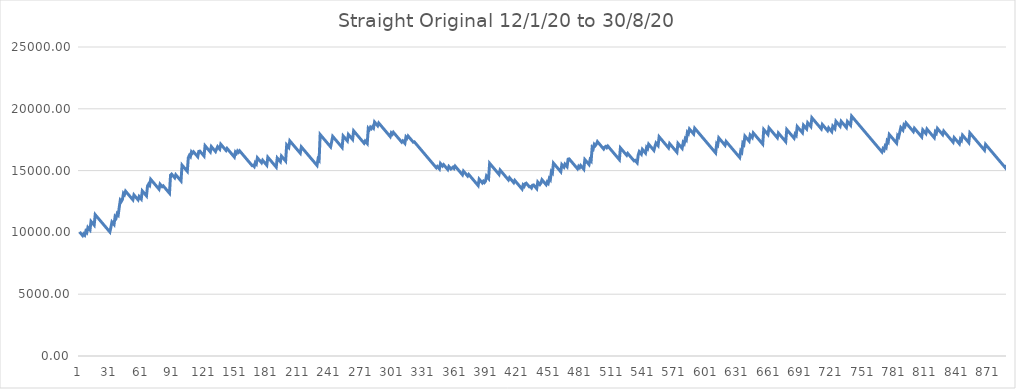
| Category | Series 0 |
|---|---|
| 0 | 10038.22 |
| 1 | 9938.22 |
| 2 | 9838.22 |
| 3 | 9738.22 |
| 4 | 9885.22 |
| 5 | 9785.22 |
| 6 | 10096.86 |
| 7 | 9996.86 |
| 8 | 10395.76 |
| 9 | 10295.76 |
| 10 | 10195.76 |
| 11 | 10887.64 |
| 12 | 10787.64 |
| 13 | 10687.64 |
| 14 | 10587.64 |
| 15 | 11432.44 |
| 16 | 11332.44 |
| 17 | 11232.44 |
| 18 | 11132.44 |
| 19 | 11032.44 |
| 20 | 10932.44 |
| 21 | 10832.44 |
| 22 | 10732.44 |
| 23 | 10632.44 |
| 24 | 10532.44 |
| 25 | 10432.44 |
| 26 | 10332.44 |
| 27 | 10232.44 |
| 28 | 10132.44 |
| 29 | 10032.44 |
| 30 | 10420.52 |
| 31 | 10841.92 |
| 32 | 10741.92 |
| 33 | 10641.92 |
| 34 | 11275 |
| 35 | 11175 |
| 36 | 11510.16 |
| 37 | 11410.16 |
| 38 | 12050.14 |
| 39 | 12613.68 |
| 40 | 12513.68 |
| 41 | 12664.6 |
| 42 | 13160.48 |
| 43 | 13060.48 |
| 44 | 13335.9 |
| 45 | 13235.9 |
| 46 | 13135.9 |
| 47 | 13035.9 |
| 48 | 12935.9 |
| 49 | 12835.9 |
| 50 | 12735.9 |
| 51 | 12635.9 |
| 52 | 13032.8 |
| 53 | 12932.8 |
| 54 | 12832.8 |
| 55 | 12732.8 |
| 56 | 12632.8 |
| 57 | 12898.46 |
| 58 | 12798.46 |
| 59 | 12698.46 |
| 60 | 13355.1 |
| 61 | 13255.1 |
| 62 | 13155.1 |
| 63 | 13055.1 |
| 64 | 12955.1 |
| 65 | 13750.98 |
| 66 | 13905.86 |
| 67 | 13805.86 |
| 68 | 14295.86 |
| 69 | 14195.86 |
| 70 | 14095.86 |
| 71 | 13995.86 |
| 72 | 13895.86 |
| 73 | 13795.86 |
| 74 | 13695.86 |
| 75 | 13595.86 |
| 76 | 13495.86 |
| 77 | 13899.66 |
| 78 | 13799.66 |
| 79 | 13699.66 |
| 80 | 13765.32 |
| 81 | 13665.32 |
| 82 | 13565.32 |
| 83 | 13465.32 |
| 84 | 13365.32 |
| 85 | 13265.32 |
| 86 | 13165.32 |
| 87 | 14636.38 |
| 88 | 14717.72 |
| 89 | 14617.72 |
| 90 | 14517.72 |
| 91 | 14417.72 |
| 92 | 14661.82 |
| 93 | 14561.82 |
| 94 | 14461.82 |
| 95 | 14361.82 |
| 96 | 14261.82 |
| 97 | 14161.82 |
| 98 | 15441.82 |
| 99 | 15341.82 |
| 100 | 15241.82 |
| 101 | 15141.82 |
| 102 | 15041.82 |
| 103 | 14941.82 |
| 104 | 16045.3 |
| 105 | 16229.58 |
| 106 | 16129.58 |
| 107 | 16513.78 |
| 108 | 16413.78 |
| 109 | 16519.66 |
| 110 | 16419.66 |
| 111 | 16319.66 |
| 112 | 16219.66 |
| 113 | 16119.66 |
| 114 | 16552.86 |
| 115 | 16578.34 |
| 116 | 16478.34 |
| 117 | 16378.34 |
| 118 | 16278.34 |
| 119 | 16178.34 |
| 120 | 17008.48 |
| 121 | 16908.48 |
| 122 | 16808.48 |
| 123 | 16708.48 |
| 124 | 16608.48 |
| 125 | 16508.48 |
| 126 | 16941.68 |
| 127 | 16841.68 |
| 128 | 16741.68 |
| 129 | 16641.68 |
| 130 | 16541.68 |
| 131 | 16747.48 |
| 132 | 16936.66 |
| 133 | 16836.66 |
| 134 | 16736.66 |
| 135 | 17132.66 |
| 136 | 17032.66 |
| 137 | 16932.66 |
| 138 | 16832.66 |
| 139 | 16732.66 |
| 140 | 16632.66 |
| 141 | 16793.42 |
| 142 | 16693.42 |
| 143 | 16593.42 |
| 144 | 16493.42 |
| 145 | 16393.42 |
| 146 | 16293.42 |
| 147 | 16193.42 |
| 148 | 16093.42 |
| 149 | 16497.26 |
| 150 | 16397.26 |
| 151 | 16583.46 |
| 152 | 16483.46 |
| 153 | 16601.06 |
| 154 | 16501.06 |
| 155 | 16401.06 |
| 156 | 16301.06 |
| 157 | 16201.06 |
| 158 | 16101.06 |
| 159 | 16001.06 |
| 160 | 15901.06 |
| 161 | 15801.06 |
| 162 | 15701.06 |
| 163 | 15601.06 |
| 164 | 15501.06 |
| 165 | 15401.06 |
| 166 | 15430.46 |
| 167 | 15330.46 |
| 168 | 15640.22 |
| 169 | 15540.22 |
| 170 | 16035.2 |
| 171 | 15935.2 |
| 172 | 15835.2 |
| 173 | 15735.2 |
| 174 | 15635.2 |
| 175 | 15835.2 |
| 176 | 15735.2 |
| 177 | 15635.2 |
| 178 | 15535.2 |
| 179 | 15435.2 |
| 180 | 16082.04 |
| 181 | 15982.04 |
| 182 | 15882.04 |
| 183 | 15782.04 |
| 184 | 15682.04 |
| 185 | 15582.04 |
| 186 | 15482.04 |
| 187 | 15382.04 |
| 188 | 15282.04 |
| 189 | 16018.06 |
| 190 | 15918.06 |
| 191 | 15818.06 |
| 192 | 15718.06 |
| 193 | 16174.86 |
| 194 | 16074.86 |
| 195 | 15974.86 |
| 196 | 15874.86 |
| 197 | 15774.86 |
| 198 | 17074.38 |
| 199 | 16974.38 |
| 200 | 16874.38 |
| 201 | 17405.58 |
| 202 | 17305.58 |
| 203 | 17205.58 |
| 204 | 17105.58 |
| 205 | 17005.58 |
| 206 | 16905.58 |
| 207 | 16805.58 |
| 208 | 16705.58 |
| 209 | 16605.58 |
| 210 | 16505.58 |
| 211 | 16405.58 |
| 212 | 16917.18 |
| 213 | 16817.18 |
| 214 | 16717.18 |
| 215 | 16617.18 |
| 216 | 16517.18 |
| 217 | 16417.18 |
| 218 | 16317.18 |
| 219 | 16217.18 |
| 220 | 16117.18 |
| 221 | 16017.18 |
| 222 | 15917.18 |
| 223 | 15817.18 |
| 224 | 15717.18 |
| 225 | 15617.18 |
| 226 | 15517.18 |
| 227 | 15417.18 |
| 228 | 15930.78 |
| 229 | 15830.78 |
| 230 | 17918.22 |
| 231 | 17818.22 |
| 232 | 17718.22 |
| 233 | 17618.22 |
| 234 | 17518.22 |
| 235 | 17418.22 |
| 236 | 17318.22 |
| 237 | 17218.22 |
| 238 | 17118.22 |
| 239 | 17018.22 |
| 240 | 16918.22 |
| 241 | 17326.96 |
| 242 | 17767.96 |
| 243 | 17667.96 |
| 244 | 17567.96 |
| 245 | 17467.96 |
| 246 | 17367.96 |
| 247 | 17267.96 |
| 248 | 17167.96 |
| 249 | 17067.96 |
| 250 | 16967.96 |
| 251 | 16867.96 |
| 252 | 17800.96 |
| 253 | 17700.96 |
| 254 | 17600.96 |
| 255 | 17500.96 |
| 256 | 17400.96 |
| 257 | 17919.42 |
| 258 | 17819.42 |
| 259 | 17719.42 |
| 260 | 17619.42 |
| 261 | 17519.42 |
| 262 | 18216.24 |
| 263 | 18116.24 |
| 264 | 18016.24 |
| 265 | 17916.24 |
| 266 | 17816.24 |
| 267 | 17716.24 |
| 268 | 17616.24 |
| 269 | 17516.24 |
| 270 | 17416.24 |
| 271 | 17316.24 |
| 272 | 17216.24 |
| 273 | 17391.7 |
| 274 | 17291.7 |
| 275 | 17191.7 |
| 276 | 18418.7 |
| 277 | 18318.7 |
| 278 | 18502 |
| 279 | 18402 |
| 280 | 18543.16 |
| 281 | 18443.16 |
| 282 | 18930.26 |
| 283 | 18830.26 |
| 284 | 18730.26 |
| 285 | 18630.26 |
| 286 | 18848.88 |
| 287 | 18748.88 |
| 288 | 18648.88 |
| 289 | 18548.88 |
| 290 | 18448.88 |
| 291 | 18348.88 |
| 292 | 18248.88 |
| 293 | 18148.88 |
| 294 | 18048.88 |
| 295 | 17948.88 |
| 296 | 17848.88 |
| 297 | 17748.88 |
| 298 | 18042.96 |
| 299 | 17942.96 |
| 300 | 18097.84 |
| 301 | 17997.84 |
| 302 | 17897.84 |
| 303 | 17797.84 |
| 304 | 17697.84 |
| 305 | 17597.84 |
| 306 | 17497.84 |
| 307 | 17397.84 |
| 308 | 17297.84 |
| 309 | 17405.64 |
| 310 | 17305.64 |
| 311 | 17205.64 |
| 312 | 17719.24 |
| 313 | 17619.24 |
| 314 | 17799.6 |
| 315 | 17699.6 |
| 316 | 17599.6 |
| 317 | 17499.6 |
| 318 | 17399.6 |
| 319 | 17299.6 |
| 320 | 17329 |
| 321 | 17229 |
| 322 | 17129 |
| 323 | 17029 |
| 324 | 16929 |
| 325 | 16829 |
| 326 | 16729 |
| 327 | 16629 |
| 328 | 16529 |
| 329 | 16429 |
| 330 | 16329 |
| 331 | 16229 |
| 332 | 16129 |
| 333 | 16029 |
| 334 | 15929 |
| 335 | 15829 |
| 336 | 15729 |
| 337 | 15629 |
| 338 | 15529 |
| 339 | 15429 |
| 340 | 15329 |
| 341 | 15229 |
| 342 | 15334.88 |
| 343 | 15234.88 |
| 344 | 15134.88 |
| 345 | 15570.08 |
| 346 | 15470.08 |
| 347 | 15370.08 |
| 348 | 15482.78 |
| 349 | 15382.78 |
| 350 | 15282.78 |
| 351 | 15182.78 |
| 352 | 15082.78 |
| 353 | 15331.78 |
| 354 | 15231.78 |
| 355 | 15131.78 |
| 356 | 15202.34 |
| 357 | 15279.76 |
| 358 | 15179.76 |
| 359 | 15361.1 |
| 360 | 15261.1 |
| 361 | 15161.1 |
| 362 | 15061.1 |
| 363 | 14961.1 |
| 364 | 14861.1 |
| 365 | 14761.1 |
| 366 | 14661.1 |
| 367 | 14955.14 |
| 368 | 14855.14 |
| 369 | 14755.14 |
| 370 | 14655.14 |
| 371 | 14555.14 |
| 372 | 14690.42 |
| 373 | 14590.42 |
| 374 | 14490.42 |
| 375 | 14390.42 |
| 376 | 14290.42 |
| 377 | 14190.42 |
| 378 | 14090.42 |
| 379 | 13990.42 |
| 380 | 13890.42 |
| 381 | 13790.42 |
| 382 | 14304.02 |
| 383 | 14204.02 |
| 384 | 14104.02 |
| 385 | 14004.02 |
| 386 | 14131.46 |
| 387 | 14031.46 |
| 388 | 14138.32 |
| 389 | 14559.72 |
| 390 | 14459.72 |
| 391 | 14359.72 |
| 392 | 15588.72 |
| 393 | 15488.72 |
| 394 | 15388.72 |
| 395 | 15288.72 |
| 396 | 15188.72 |
| 397 | 15088.72 |
| 398 | 14988.72 |
| 399 | 14888.72 |
| 400 | 14788.72 |
| 401 | 14688.72 |
| 402 | 15043.52 |
| 403 | 14943.52 |
| 404 | 14843.52 |
| 405 | 14743.52 |
| 406 | 14643.52 |
| 407 | 14543.52 |
| 408 | 14443.52 |
| 409 | 14343.52 |
| 410 | 14243.52 |
| 411 | 14423.92 |
| 412 | 14323.92 |
| 413 | 14223.92 |
| 414 | 14123.92 |
| 415 | 14023.92 |
| 416 | 14207.22 |
| 417 | 14107.22 |
| 418 | 14007.22 |
| 419 | 13907.22 |
| 420 | 13807.22 |
| 421 | 13707.22 |
| 422 | 13607.22 |
| 423 | 13507.22 |
| 424 | 13832.58 |
| 425 | 13732.58 |
| 426 | 13944.26 |
| 427 | 13982.48 |
| 428 | 13882.48 |
| 429 | 13782.48 |
| 430 | 13682.48 |
| 431 | 13703.06 |
| 432 | 13603.06 |
| 433 | 13816.74 |
| 434 | 13837.32 |
| 435 | 13737.32 |
| 436 | 13637.32 |
| 437 | 13537.32 |
| 438 | 14070.52 |
| 439 | 13970.52 |
| 440 | 13870.52 |
| 441 | 13991.06 |
| 442 | 14259.58 |
| 443 | 14159.58 |
| 444 | 14059.58 |
| 445 | 13959.58 |
| 446 | 13859.58 |
| 447 | 14075.18 |
| 448 | 13975.18 |
| 449 | 14359.38 |
| 450 | 14259.38 |
| 451 | 14906.18 |
| 452 | 14806.18 |
| 453 | 15604.96 |
| 454 | 15504.96 |
| 455 | 15404.96 |
| 456 | 15304.96 |
| 457 | 15204.96 |
| 458 | 15104.96 |
| 459 | 15004.96 |
| 460 | 14904.96 |
| 461 | 15481.36 |
| 462 | 15381.36 |
| 463 | 15281.36 |
| 464 | 15517.58 |
| 465 | 15417.58 |
| 466 | 15317.58 |
| 467 | 15925.18 |
| 468 | 15947.72 |
| 469 | 15847.72 |
| 470 | 15747.72 |
| 471 | 15647.72 |
| 472 | 15547.72 |
| 473 | 15447.72 |
| 474 | 15347.72 |
| 475 | 15247.72 |
| 476 | 15147.72 |
| 477 | 15342.74 |
| 478 | 15242.74 |
| 479 | 15410.32 |
| 480 | 15310.32 |
| 481 | 15210.32 |
| 482 | 15110.32 |
| 483 | 15889.46 |
| 484 | 15789.46 |
| 485 | 15689.46 |
| 486 | 15589.46 |
| 487 | 15489.46 |
| 488 | 15883.46 |
| 489 | 15783.46 |
| 490 | 16861.46 |
| 491 | 16761.46 |
| 492 | 17116.26 |
| 493 | 17016.26 |
| 494 | 17133.9 |
| 495 | 17344.6 |
| 496 | 17244.6 |
| 497 | 17144.6 |
| 498 | 17044.6 |
| 499 | 16944.6 |
| 500 | 16844.6 |
| 501 | 16744.6 |
| 502 | 16897.48 |
| 503 | 16958.24 |
| 504 | 16858.24 |
| 505 | 16981.72 |
| 506 | 16881.72 |
| 507 | 16781.72 |
| 508 | 16681.72 |
| 509 | 16581.72 |
| 510 | 16481.72 |
| 511 | 16381.72 |
| 512 | 16281.72 |
| 513 | 16181.72 |
| 514 | 16081.72 |
| 515 | 15981.72 |
| 516 | 15881.72 |
| 517 | 16836.32 |
| 518 | 16736.32 |
| 519 | 16636.32 |
| 520 | 16536.32 |
| 521 | 16436.32 |
| 522 | 16336.32 |
| 523 | 16236.32 |
| 524 | 16389.24 |
| 525 | 16289.24 |
| 526 | 16189.24 |
| 527 | 16089.24 |
| 528 | 15989.24 |
| 529 | 15889.24 |
| 530 | 15789.24 |
| 531 | 15831.38 |
| 532 | 15731.38 |
| 533 | 15631.38 |
| 534 | 16249.8 |
| 535 | 16529.1 |
| 536 | 16429.1 |
| 537 | 16329.1 |
| 538 | 16716.24 |
| 539 | 16616.24 |
| 540 | 16516.24 |
| 541 | 16416.24 |
| 542 | 16872.92 |
| 543 | 16772.92 |
| 544 | 17135.56 |
| 545 | 17035.56 |
| 546 | 16935.56 |
| 547 | 16835.56 |
| 548 | 16735.56 |
| 549 | 16635.56 |
| 550 | 16958.96 |
| 551 | 17226.54 |
| 552 | 17126.54 |
| 553 | 17026.54 |
| 554 | 17734.14 |
| 555 | 17634.14 |
| 556 | 17534.14 |
| 557 | 17434.14 |
| 558 | 17334.14 |
| 559 | 17234.14 |
| 560 | 17134.14 |
| 561 | 17034.14 |
| 562 | 16934.14 |
| 563 | 16834.14 |
| 564 | 17184.04 |
| 565 | 17084.04 |
| 566 | 16984.04 |
| 567 | 16884.04 |
| 568 | 16784.04 |
| 569 | 16684.04 |
| 570 | 16584.04 |
| 571 | 16484.04 |
| 572 | 17197.52 |
| 573 | 17097.52 |
| 574 | 16997.52 |
| 575 | 16897.52 |
| 576 | 16797.52 |
| 577 | 17279.72 |
| 578 | 17179.72 |
| 579 | 17578.62 |
| 580 | 17478.62 |
| 581 | 18088.22 |
| 582 | 17988.22 |
| 583 | 18362.62 |
| 584 | 18262.62 |
| 585 | 18162.62 |
| 586 | 18062.62 |
| 587 | 17962.62 |
| 588 | 18429.14 |
| 589 | 18329.14 |
| 590 | 18229.14 |
| 591 | 18129.14 |
| 592 | 18029.14 |
| 593 | 17929.14 |
| 594 | 17829.14 |
| 595 | 17729.14 |
| 596 | 17629.14 |
| 597 | 17529.14 |
| 598 | 17429.14 |
| 599 | 17329.14 |
| 600 | 17229.14 |
| 601 | 17129.14 |
| 602 | 17029.14 |
| 603 | 16929.14 |
| 604 | 16829.14 |
| 605 | 16729.14 |
| 606 | 16629.14 |
| 607 | 16529.14 |
| 608 | 16429.14 |
| 609 | 17163.2 |
| 610 | 17063.2 |
| 611 | 17648.3 |
| 612 | 17548.3 |
| 613 | 17448.3 |
| 614 | 17348.3 |
| 615 | 17248.3 |
| 616 | 17148.3 |
| 617 | 17048.3 |
| 618 | 17359 |
| 619 | 17259 |
| 620 | 17159 |
| 621 | 17059 |
| 622 | 16959 |
| 623 | 16859 |
| 624 | 16759 |
| 625 | 16659 |
| 626 | 16559 |
| 627 | 16459 |
| 628 | 16359 |
| 629 | 16259 |
| 630 | 16159 |
| 631 | 16059 |
| 632 | 16590.2 |
| 633 | 16490.2 |
| 634 | 17217.4 |
| 635 | 17117.4 |
| 636 | 17789.72 |
| 637 | 17689.72 |
| 638 | 17589.72 |
| 639 | 17489.72 |
| 640 | 17389.72 |
| 641 | 17872.9 |
| 642 | 17772.9 |
| 643 | 17672.9 |
| 644 | 18045.34 |
| 645 | 17945.34 |
| 646 | 17845.34 |
| 647 | 17745.34 |
| 648 | 17645.34 |
| 649 | 17545.34 |
| 650 | 17445.34 |
| 651 | 17345.34 |
| 652 | 17245.34 |
| 653 | 17145.34 |
| 654 | 18323.34 |
| 655 | 18223.34 |
| 656 | 18123.34 |
| 657 | 18023.34 |
| 658 | 17923.34 |
| 659 | 18454.54 |
| 660 | 18354.54 |
| 661 | 18254.54 |
| 662 | 18154.54 |
| 663 | 18054.54 |
| 664 | 17954.54 |
| 665 | 17854.54 |
| 666 | 17754.54 |
| 667 | 17654.54 |
| 668 | 18038.74 |
| 669 | 17938.74 |
| 670 | 17838.74 |
| 671 | 17738.74 |
| 672 | 17638.74 |
| 673 | 17538.74 |
| 674 | 17438.74 |
| 675 | 17338.74 |
| 676 | 18320.74 |
| 677 | 18220.74 |
| 678 | 18120.74 |
| 679 | 18020.74 |
| 680 | 17920.74 |
| 681 | 17820.74 |
| 682 | 17720.74 |
| 683 | 17620.74 |
| 684 | 17953.98 |
| 685 | 17853.98 |
| 686 | 18561.58 |
| 687 | 18461.58 |
| 688 | 18361.58 |
| 689 | 18261.58 |
| 690 | 18161.58 |
| 691 | 18061.58 |
| 692 | 18671.18 |
| 693 | 18571.18 |
| 694 | 18471.18 |
| 695 | 18371.18 |
| 696 | 18867.1 |
| 697 | 18767.1 |
| 698 | 18667.1 |
| 699 | 18567.1 |
| 700 | 19274.7 |
| 701 | 19174.7 |
| 702 | 19074.7 |
| 703 | 18974.7 |
| 704 | 18874.7 |
| 705 | 18774.7 |
| 706 | 18674.7 |
| 707 | 18574.7 |
| 708 | 18474.7 |
| 709 | 18374.7 |
| 710 | 18731.46 |
| 711 | 18631.46 |
| 712 | 18531.46 |
| 713 | 18431.46 |
| 714 | 18331.46 |
| 715 | 18231.46 |
| 716 | 18455.92 |
| 717 | 18355.92 |
| 718 | 18255.92 |
| 719 | 18155.92 |
| 720 | 18595 |
| 721 | 18495 |
| 722 | 18395 |
| 723 | 18987.94 |
| 724 | 18887.94 |
| 725 | 18787.94 |
| 726 | 18687.94 |
| 727 | 18587.94 |
| 728 | 18984.88 |
| 729 | 18884.88 |
| 730 | 18784.88 |
| 731 | 18684.88 |
| 732 | 18584.88 |
| 733 | 18484.88 |
| 734 | 18967.08 |
| 735 | 18867.08 |
| 736 | 18767.08 |
| 737 | 18667.08 |
| 738 | 19405.06 |
| 739 | 19305.06 |
| 740 | 19205.06 |
| 741 | 19105.06 |
| 742 | 19005.06 |
| 743 | 18905.06 |
| 744 | 18805.06 |
| 745 | 18705.06 |
| 746 | 18605.06 |
| 747 | 18505.06 |
| 748 | 18405.06 |
| 749 | 18305.06 |
| 750 | 18205.06 |
| 751 | 18105.06 |
| 752 | 18005.06 |
| 753 | 17905.06 |
| 754 | 17805.06 |
| 755 | 17705.06 |
| 756 | 17605.06 |
| 757 | 17505.06 |
| 758 | 17405.06 |
| 759 | 17305.06 |
| 760 | 17205.06 |
| 761 | 17105.06 |
| 762 | 17005.06 |
| 763 | 16905.06 |
| 764 | 16805.06 |
| 765 | 16705.06 |
| 766 | 16605.06 |
| 767 | 16505.06 |
| 768 | 16761.86 |
| 769 | 16661.86 |
| 770 | 16980.4 |
| 771 | 16880.4 |
| 772 | 17411.6 |
| 773 | 17311.6 |
| 774 | 17921.2 |
| 775 | 17821.2 |
| 776 | 17721.2 |
| 777 | 17621.2 |
| 778 | 17521.2 |
| 779 | 17421.2 |
| 780 | 17321.2 |
| 781 | 17221.2 |
| 782 | 17831.78 |
| 783 | 17731.78 |
| 784 | 18098.34 |
| 785 | 18478.62 |
| 786 | 18378.62 |
| 787 | 18278.62 |
| 788 | 18682.42 |
| 789 | 18582.42 |
| 790 | 18856.86 |
| 791 | 18756.86 |
| 792 | 18656.86 |
| 793 | 18556.86 |
| 794 | 18456.86 |
| 795 | 18356.86 |
| 796 | 18256.86 |
| 797 | 18156.86 |
| 798 | 18423.46 |
| 799 | 18323.46 |
| 800 | 18223.46 |
| 801 | 18123.46 |
| 802 | 18023.46 |
| 803 | 17923.46 |
| 804 | 17823.46 |
| 805 | 17723.46 |
| 806 | 18293.86 |
| 807 | 18193.86 |
| 808 | 18093.86 |
| 809 | 17993.86 |
| 810 | 18357.48 |
| 811 | 18257.48 |
| 812 | 18157.48 |
| 813 | 18057.48 |
| 814 | 17957.48 |
| 815 | 17857.48 |
| 816 | 17757.48 |
| 817 | 17657.48 |
| 818 | 18135.76 |
| 819 | 18035.76 |
| 820 | 18409.18 |
| 821 | 18309.18 |
| 822 | 18209.18 |
| 823 | 18109.18 |
| 824 | 18009.18 |
| 825 | 17909.18 |
| 826 | 18199.3 |
| 827 | 18099.3 |
| 828 | 17999.3 |
| 829 | 17899.3 |
| 830 | 17799.3 |
| 831 | 17699.3 |
| 832 | 17599.3 |
| 833 | 17499.3 |
| 834 | 17399.3 |
| 835 | 17299.3 |
| 836 | 17665.86 |
| 837 | 17565.86 |
| 838 | 17465.86 |
| 839 | 17365.86 |
| 840 | 17265.86 |
| 841 | 17165.86 |
| 842 | 17550.06 |
| 843 | 17450.06 |
| 844 | 17863.66 |
| 845 | 17763.66 |
| 846 | 17663.66 |
| 847 | 17563.66 |
| 848 | 17463.66 |
| 849 | 17363.66 |
| 850 | 17263.66 |
| 851 | 18049.66 |
| 852 | 17949.66 |
| 853 | 17849.66 |
| 854 | 17749.66 |
| 855 | 17649.66 |
| 856 | 17549.66 |
| 857 | 17449.66 |
| 858 | 17349.66 |
| 859 | 17249.66 |
| 860 | 17149.66 |
| 861 | 17049.66 |
| 862 | 16949.66 |
| 863 | 16849.66 |
| 864 | 16749.66 |
| 865 | 16649.66 |
| 866 | 17122.06 |
| 867 | 17022.06 |
| 868 | 16922.06 |
| 869 | 16822.06 |
| 870 | 16722.06 |
| 871 | 16622.06 |
| 872 | 16522.06 |
| 873 | 16422.06 |
| 874 | 16322.06 |
| 875 | 16222.06 |
| 876 | 16122.06 |
| 877 | 16022.06 |
| 878 | 15922.06 |
| 879 | 15822.06 |
| 880 | 15722.06 |
| 881 | 15622.06 |
| 882 | 15522.06 |
| 883 | 15422.06 |
| 884 | 15322.06 |
| 885 | 15222.06 |
| 886 | 15439.66 |